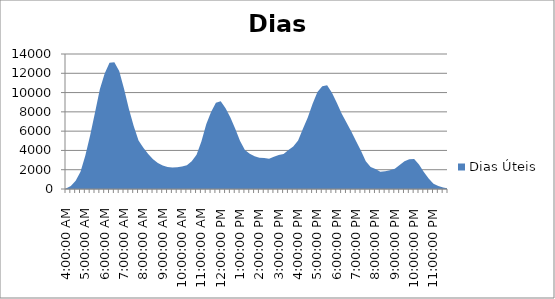
| Category | Dias Úteis |
|---|---|
| 0.16666666666666663 | 58.4 |
| 0.1770833333333333 | 301.4 |
| 0.18749999999999994 | 844.4 |
| 0.1979166666666666 | 1798.2 |
| 0.20833333333333326 | 3486.2 |
| 0.21874999999999992 | 5583.2 |
| 0.22916666666666657 | 7939.6 |
| 0.23958333333333323 | 10341 |
| 0.2499999999999999 | 11980.2 |
| 0.2604166666666666 | 13097.6 |
| 0.27083333333333326 | 13155.6 |
| 0.28124999999999994 | 12225.2 |
| 0.29166666666666663 | 10394 |
| 0.3020833333333333 | 8326 |
| 0.3125 | 6531 |
| 0.3229166666666667 | 5042 |
| 0.33333333333333337 | 4284.6 |
| 0.34375000000000006 | 3631.6 |
| 0.35416666666666674 | 3073.8 |
| 0.3645833333333334 | 2688.4 |
| 0.3750000000000001 | 2440 |
| 0.3854166666666668 | 2279.8 |
| 0.3958333333333335 | 2218.4 |
| 0.40625000000000017 | 2244.4 |
| 0.41666666666666685 | 2343.4 |
| 0.42708333333333354 | 2454 |
| 0.4375000000000002 | 2883 |
| 0.4479166666666669 | 3544.6 |
| 0.4583333333333336 | 4928.8 |
| 0.4687500000000003 | 6723 |
| 0.47916666666666696 | 7994.2 |
| 0.48958333333333365 | 8938.6 |
| 0.5000000000000003 | 9095.2 |
| 0.510416666666667 | 8378.2 |
| 0.5208333333333336 | 7415.6 |
| 0.5312500000000002 | 6237.6 |
| 0.5416666666666669 | 4965.6 |
| 0.5520833333333335 | 4044.8 |
| 0.5625000000000001 | 3654 |
| 0.5729166666666667 | 3405.4 |
| 0.5833333333333334 | 3228.6 |
| 0.59375 | 3215 |
| 0.6041666666666666 | 3147.4 |
| 0.6145833333333333 | 3340.2 |
| 0.6249999999999999 | 3523 |
| 0.6354166666666665 | 3634.4 |
| 0.6458333333333331 | 4047.6 |
| 0.6562499999999998 | 4401.8 |
| 0.6666666666666664 | 5018.8 |
| 0.677083333333333 | 6241.2 |
| 0.6874999999999997 | 7424 |
| 0.6979166666666663 | 8840 |
| 0.7083333333333329 | 10052.4 |
| 0.7187499999999996 | 10660.6 |
| 0.7291666666666662 | 10761.4 |
| 0.7395833333333328 | 9985 |
| 0.7499999999999994 | 8933.6 |
| 0.7604166666666661 | 7828.4 |
| 0.7708333333333327 | 6906.6 |
| 0.7812499999999993 | 5975.6 |
| 0.791666666666666 | 4942.2 |
| 0.8020833333333326 | 3974.6 |
| 0.8124999999999992 | 2867.2 |
| 0.8229166666666659 | 2291.2 |
| 0.8333333333333325 | 2062 |
| 0.8437499999999991 | 1787.6 |
| 0.8541666666666657 | 1842.8 |
| 0.8645833333333324 | 1950.8 |
| 0.874999999999999 | 2088 |
| 0.8854166666666656 | 2495 |
| 0.8958333333333323 | 2883.2 |
| 0.9062499999999989 | 3093.6 |
| 0.9166666666666655 | 3109.2 |
| 0.9270833333333321 | 2535.8 |
| 0.9374999999999988 | 1753.6 |
| 0.9479166666666654 | 1076.2 |
| 0.958333333333332 | 556.4 |
| 0.9687499999999987 | 298.4 |
| 0.9791666666666653 | 147.2 |
| 0.9895833333333319 | 64 |